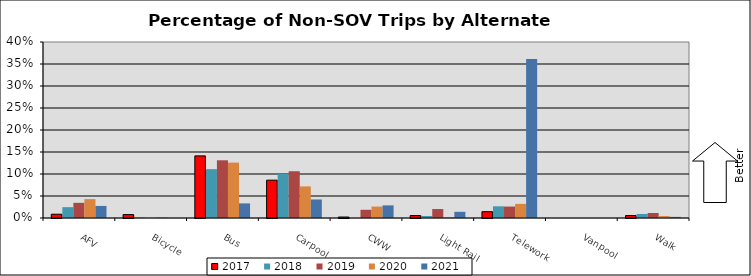
| Category | 2017 | 2018 | 2019 | 2020 | 2021 |
|---|---|---|---|---|---|
| AFV | 0.009 | 0.025 | 0.034 | 0.043 | 0.027 |
| Bicycle | 0.008 | 0.001 | 0 | 0.002 | 0 |
| Bus | 0.141 | 0.111 | 0.131 | 0.126 | 0.033 |
| Carpool | 0.086 | 0.1 | 0.106 | 0.072 | 0.042 |
| CWW | 0.002 | 0 | 0.019 | 0.026 | 0.029 |
| Light Rail | 0.006 | 0.005 | 0.02 | 0.002 | 0.014 |
| Telework | 0.014 | 0.027 | 0.026 | 0.032 | 0.361 |
| Vanpool | 0 | 0 | 0 | 0 | 0 |
| Walk | 0.006 | 0.009 | 0.011 | 0.004 | 0.003 |